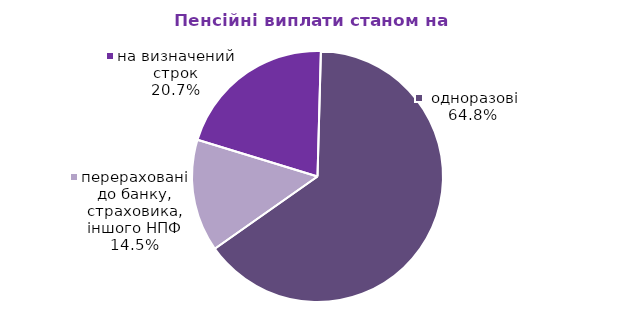
| Category | Series 0 |
|---|---|
| на визначений строк | 142.221 |
|  одноразові | 445.047 |
| перераховані до банку, страховика, іншого НПФ | 99.456 |